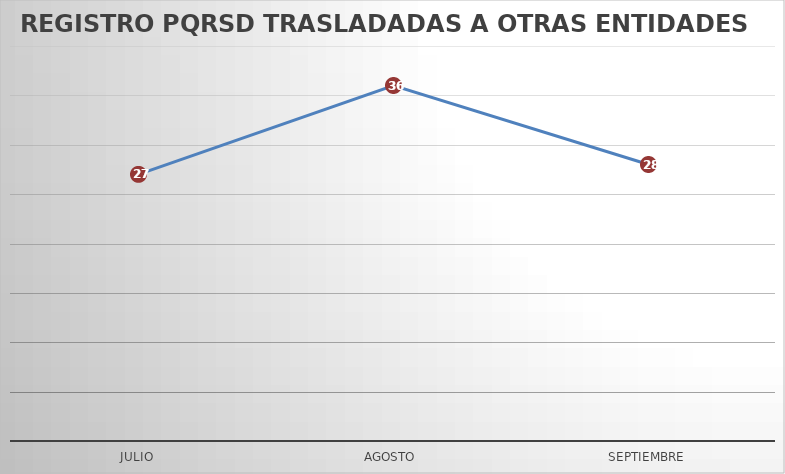
| Category | Series 0 |
|---|---|
| JULIO | 27 |
| AGOSTO | 36 |
| SEPTIEMBRE | 28 |